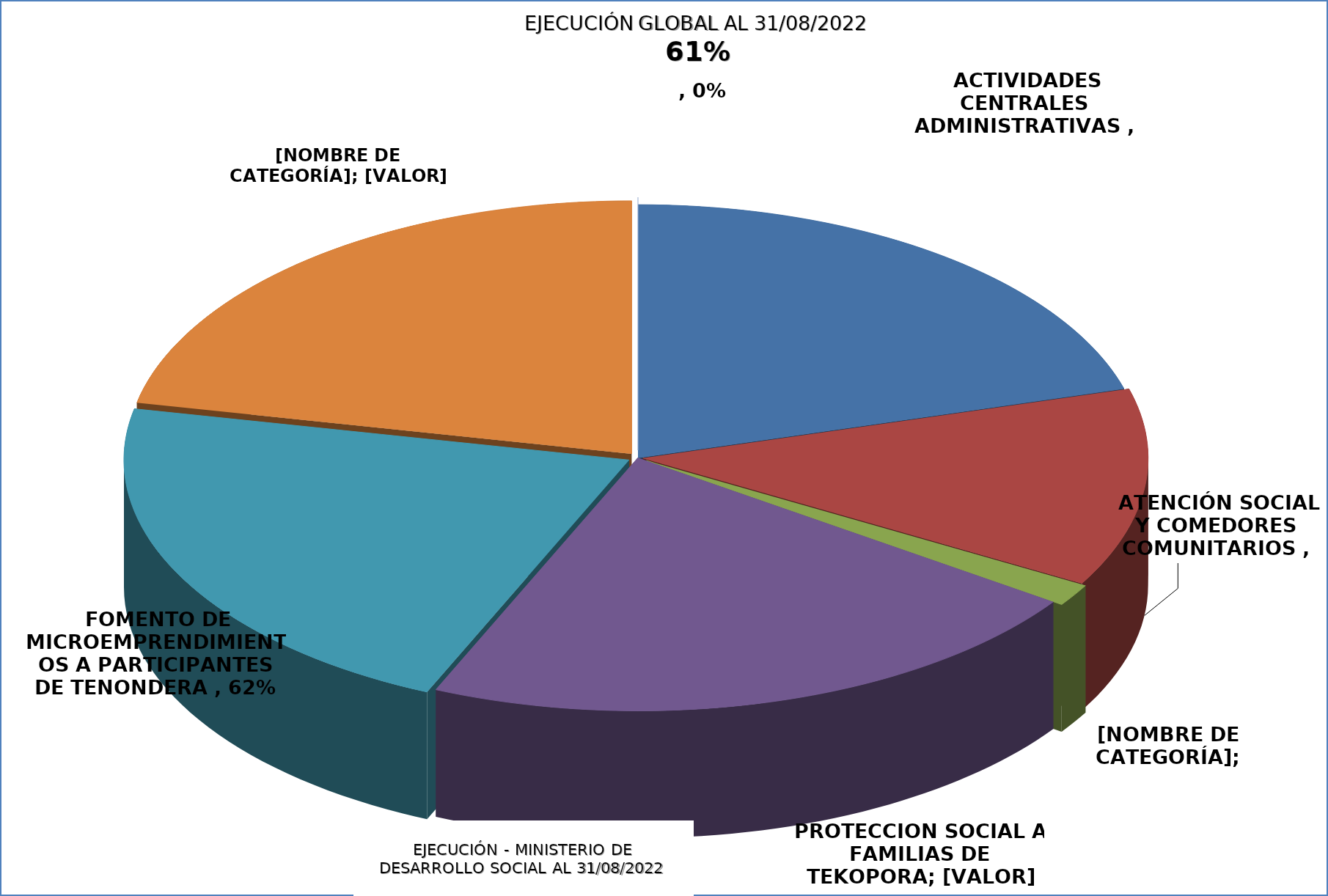
| Category | EJECUCIÓN - MINISTERIO DE DESARROLLO SOCIAL |
|---|---|
| ACTIVIDADES CENTRALES ADMINISTRATIVAS | 0.592 |
| ATENCIÓN SOCIAL Y COMEDORES COMUNITARIOS | 0.363 |
| ASISTENCIA A PESCADORES POR VEDA PESQUERA | 0.041 |
| PROTECCIÓN SOCIAL A FAMILIAS DE TEKOPORA  | 0.629 |
| FOMENTO DE MICROEMPRENDIMIENTOS A PARTICIPANTES DE TENONDERA | 0.623 |
| REGULARIZACIÓN DE TERRITORIOS SOCIALES, TEKOHA | 0.625 |